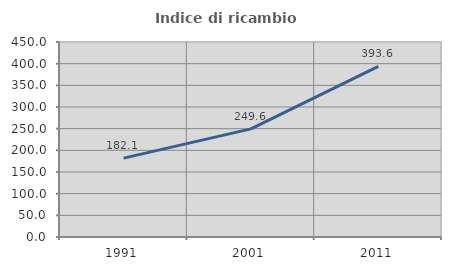
| Category | Indice di ricambio occupazionale  |
|---|---|
| 1991.0 | 182.051 |
| 2001.0 | 249.6 |
| 2011.0 | 393.636 |